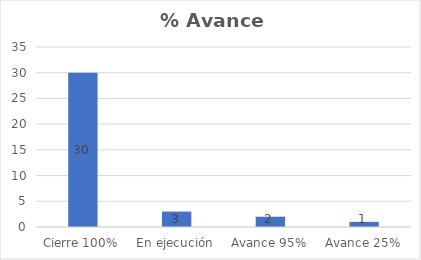
| Category | Series 0 |
|---|---|
| Cierre 100% | 30 |
| En ejecución | 3 |
| Avance 95% | 2 |
| Avance 25% | 1 |